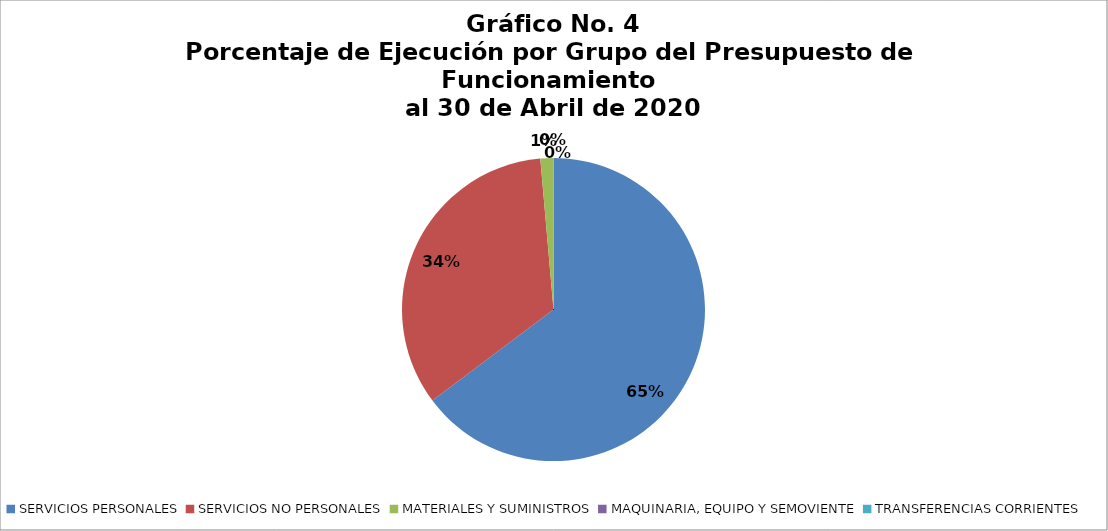
| Category | Series 0 |
|---|---|
| SERVICIOS PERSONALES | 354217.86 |
| SERVICIOS NO PERSONALES | 185373.67 |
| MATERIALES Y SUMINISTROS | 7610.57 |
| MAQUINARIA, EQUIPO Y SEMOVIENTE | 0 |
| TRANSFERENCIAS CORRIENTES | 0 |